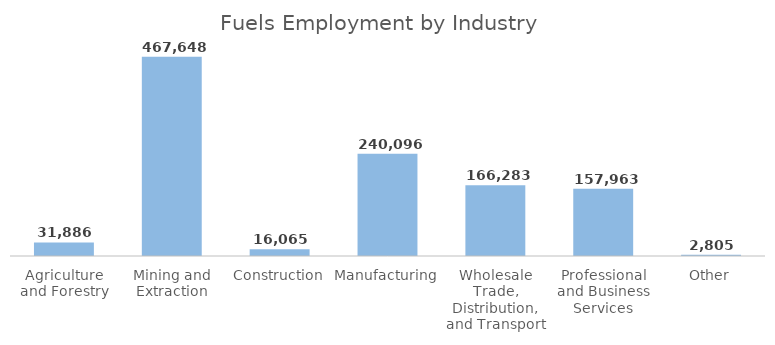
| Category | Fuels Employment by Industry |
|---|---|
| Agriculture and Forestry | 31886.234 |
| Mining and Extraction | 467647.513 |
| Construction | 16065 |
| Manufacturing | 240095.723 |
| Wholesale Trade, Distribution, and Transport | 166282.552 |
| Professional and Business Services | 157962.618 |
| Other | 2805.141 |